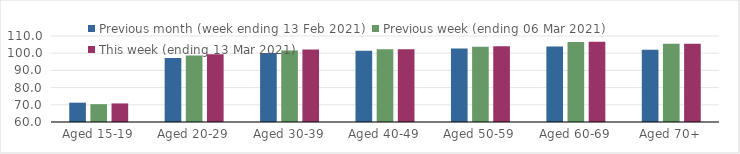
| Category | Previous month (week ending 13 Feb 2021) | Previous week (ending 06 Mar 2021) | This week (ending 13 Mar 2021) |
|---|---|---|---|
| Aged 15-19 | 71.23 | 70.37 | 70.8 |
| Aged 20-29 | 97.23 | 98.66 | 99.32 |
| Aged 30-39 | 100.13 | 101.58 | 102.22 |
| Aged 40-49 | 101.44 | 102.27 | 102.36 |
| Aged 50-59 | 102.67 | 103.79 | 104.01 |
| Aged 60-69 | 103.84 | 106.44 | 106.69 |
| Aged 70+ | 101.94 | 105.56 | 105.55 |